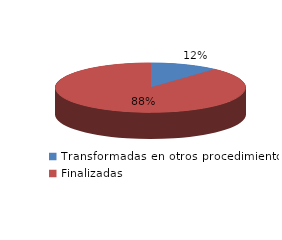
| Category | Series 0 |
|---|---|
| Transformadas en otros procedimientos | 8190 |
| Finalizadas | 62203 |